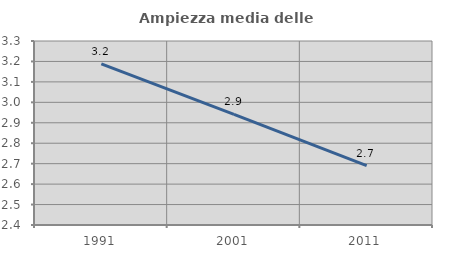
| Category | Ampiezza media delle famiglie |
|---|---|
| 1991.0 | 3.189 |
| 2001.0 | 2.942 |
| 2011.0 | 2.69 |